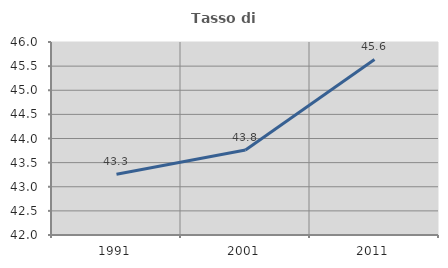
| Category | Tasso di occupazione   |
|---|---|
| 1991.0 | 43.258 |
| 2001.0 | 43.763 |
| 2011.0 | 45.639 |